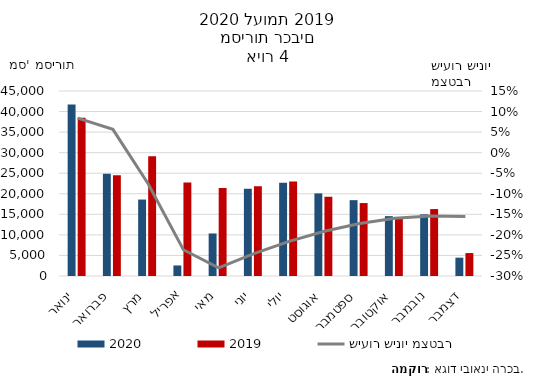
| Category | 2020 | 2019 |
|---|---|---|
| ינואר | 41712 | 38475 |
| פברואר | 24861 | 24520 |
| מרץ | 18595 | 29123 |
| אפריל | 2562 | 22725 |
| מאי | 10347 | 21401 |
| יוני | 21217 | 21838 |
| יולי | 22696 | 22993 |
| אוגוסט | 20090 | 19279 |
| ספטמבר | 18447 | 17740 |
| אוקטובר | 14559 | 13983 |
| נובמבר | 15000 | 16280 |
| דצמבר | 4458 | 5581 |